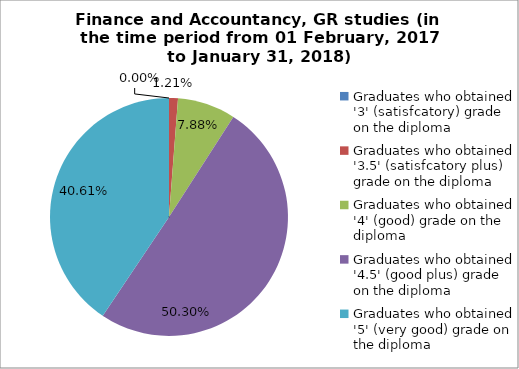
| Category | Series 1 |
|---|---|
| Graduates who obtained '3' (satisfcatory) grade on the diploma  | 0 |
| Graduates who obtained '3.5' (satisfcatory plus) grade on the diploma  | 1.212 |
| Graduates who obtained '4' (good) grade on the diploma  | 7.879 |
| Graduates who obtained '4.5' (good plus) grade on the diploma  | 50.303 |
| Graduates who obtained '5' (very good) grade on the diploma  | 40.606 |